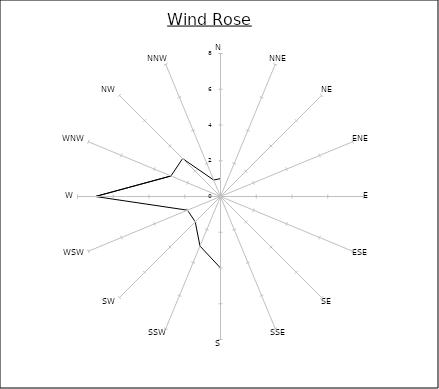
| Category | Series 0 |
|---|---|
| N | 1 |
| NNE | 0 |
| NE | 4 |
| ENE | 0 |
| E | 1 |
| ESE | 0 |
| SE | 0 |
| SSE | 0 |
| S | 4 |
| SSW | 3 |
| SW | 2 |
| WSW | 2 |
| W | 7 |
| WNW | 3 |
| NW | 3 |
| NNW | 1 |